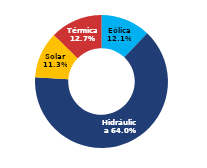
| Category | Sur |
|---|---|
| Eólica | 66.445 |
| Hidráulica | 352.653 |
| Solar | 62.219 |
| Térmica | 69.931 |